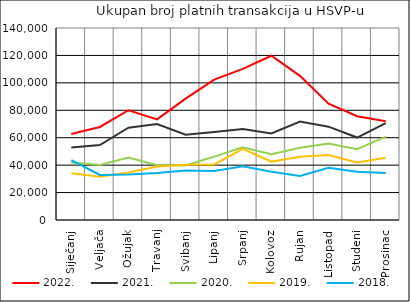
| Category | 2022. | 2021. | 2020. | 2019. | 2018. |
|---|---|---|---|---|---|
| Siječanj | 62721 | 52920 | 41895 | 34043 | 43740 |
| Veljača | 67834 | 54604 | 40110 | 31600 | 32897 |
| Ožujak | 80050 | 67292 | 45611 | 34667 | 33232 |
| Travanj | 73356 | 69996 | 39897 | 38963 | 34311 |
| Svibanj | 88536 | 62208 | 39808 | 40344 | 36156 |
| Lipanj | 102343 | 64153 | 46236 | 40472 | 35742 |
| Srpanj | 110191 | 66371 | 53059 | 51806 | 39184 |
| Kolovoz | 119751 | 63069 | 47894 | 42516 | 35142 |
| Rujan | 105076 | 71734 | 52640 | 46060 | 32058 |
| Listopad | 84749 | 68039 | 55705 | 47355 | 38001 |
| Studeni | 75679 | 60129 | 51612 | 41972 | 35099 |
| Prosinac | 72083 | 70661 | 60813 | 45440 | 34285 |